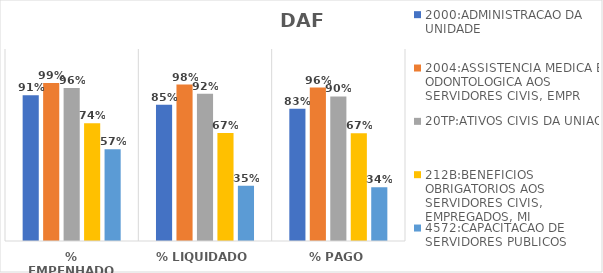
| Category | 2000:ADMINISTRACAO DA UNIDADE | 2004:ASSISTENCIA MEDICA E ODONTOLOGICA AOS SERVIDORES CIVIS, EMPR | 20TP:ATIVOS CIVIS DA UNIAO | 212B:BENEFICIOS OBRIGATORIOS AOS SERVIDORES CIVIS, EMPREGADOS, MI | 4572:CAPACITACAO DE SERVIDORES PUBLICOS FEDERAIS EM PROCESSO DE Q |
|---|---|---|---|---|---|
| % EMPENHADO | 0.911 | 0.988 | 0.956 | 0.736 | 0.574 |
| % LIQUIDADO | 0.851 | 0.978 | 0.92 | 0.674 | 0.345 |
| % PAGO | 0.826 | 0.959 | 0.904 | 0.673 | 0.336 |